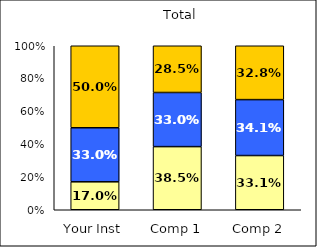
| Category | Low Social Self-Concept | Average Social Self-Concept | High Social Self-Concept |
|---|---|---|---|
| Your Inst | 0.17 | 0.33 | 0.5 |
| Comp 1 | 0.385 | 0.33 | 0.285 |
| Comp 2 | 0.331 | 0.341 | 0.328 |